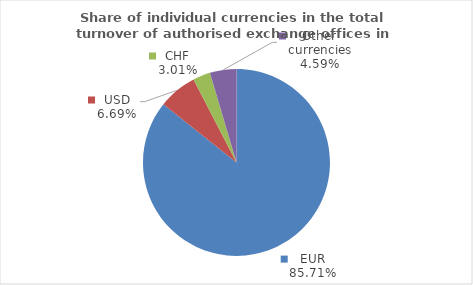
| Category | Series 0 |
|---|---|
| EUR | 85.706 |
| USD | 6.694 |
| CHF | 3.012 |
| Other currencies | 4.588 |